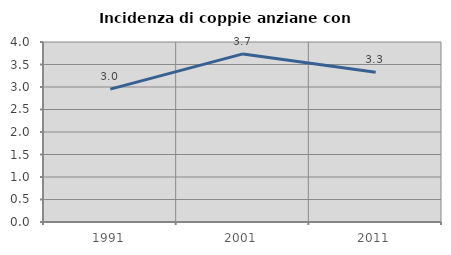
| Category | Incidenza di coppie anziane con figli |
|---|---|
| 1991.0 | 2.953 |
| 2001.0 | 3.735 |
| 2011.0 | 3.327 |